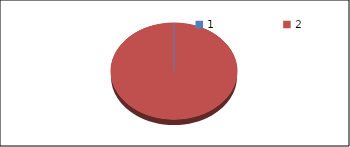
| Category | Series1 |
|---|---|
| 0 | 0 |
| 1 | 11.2 |